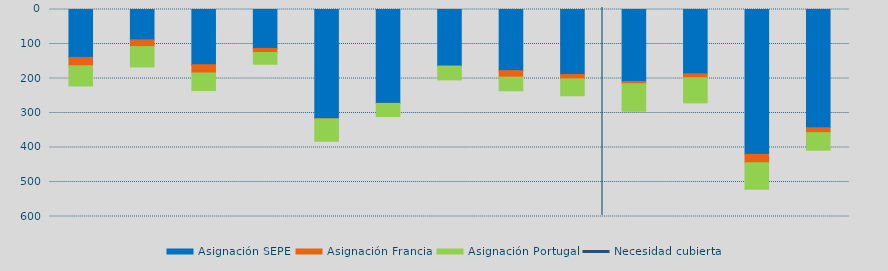
| Category | Asignación SEPE | Asignación Francia | Asignación Portugal |
|---|---|---|---|
| 0 | 138850.6 | 24132.5 | 58650.9 |
| 1 | 88000.9 | 19527.1 | 58931.4 |
| 2 | 159946.5 | 23926.8 | 51284.5 |
| 3 | 112774.35 | 11873.6 | 33973.4 |
| 4 | 316845.45 | 263.2 | 64888 |
| 5 | 271981.65 | 348.4 | 37996.4 |
| 6 | 164113.775 | 130 | 39763.3 |
| 7 | 177218.25 | 18818.7 | 39543.6 |
| 8 | 188386.325 | 12730.4 | 48945.8 |
| 9 | 208745.675 | 6515.6 | 79746.7 |
| 10 | 186451.1 | 11423.2 | 72605.3 |
| 11 | 419821.425 | 24373.9 | 76706.4 |
| 12 | 342830.4 | 14091.1 | 50867.1 |